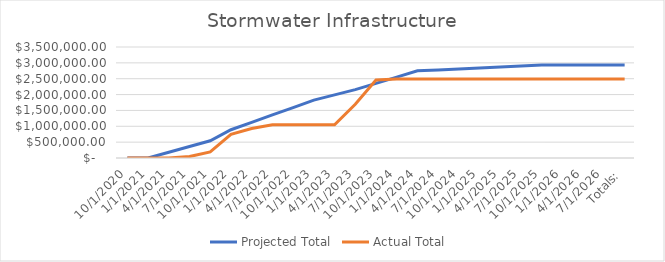
| Category | Projected Total | Actual Total  |
|---|---|---|
| 10/1/2020 | 0 | 0 |
| 1/1/2021 | 0 | 0 |
| 4/1/2021 | 181170.375 | 0 |
| 7/1/2021 | 362340.75 | 44778 |
| 10/1/2021 | 543511.125 | 190705 |
| 1/1/2022 | 891211.3 | 748969 |
| 4/1/2022 | 1124294.725 | 929629 |
| 7/1/2022 | 1357378.15 | 1046956 |
| 10/1/2022 | 1590461.575 | 1046956 |
| 1/1/2023 | 1823545 | 1046956 |
| 4/1/2023 | 1990074.8 | 1046956 |
| 7/1/2023 | 2156604.6 | 1695220.11 |
| 10/1/2023 | 2353689.956 | 2459401.65 |
| 1/1/2024 | 2550775.311 | 2489664.2 |
| 4/1/2024 | 2747860.667 | 2489664.2 |
| 7/1/2024 | 2778416.222 | 2489664.2 |
| 10/1/2024 | 2808971.778 | 2489664.2 |
| 1/1/2025 | 2839527.333 | 2489664.2 |
| 4/1/2025 | 2870082.889 | 2489664.2 |
| 7/1/2025 | 2900638.444 | 2489664.2 |
| 10/1/2025 | 2931194 | 2489664.2 |
| 1/1/2026 | 2931194 | 2489664.2 |
| 4/1/2026 | 2931194 | 2489664.2 |
| 7/1/2026 | 2931194 | 2489664.2 |
| Totals: | 2931194 | 2489664.2 |